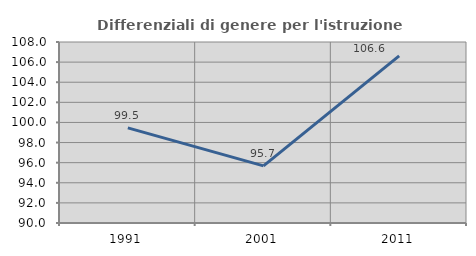
| Category | Differenziali di genere per l'istruzione superiore |
|---|---|
| 1991.0 | 99.454 |
| 2001.0 | 95.679 |
| 2011.0 | 106.618 |